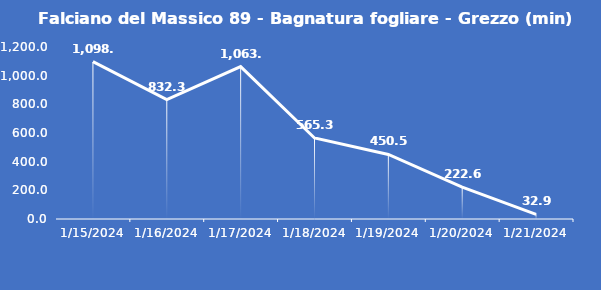
| Category | Falciano del Massico 89 - Bagnatura fogliare - Grezzo (min) |
|---|---|
| 1/15/24 | 1098.1 |
| 1/16/24 | 832.3 |
| 1/17/24 | 1063.6 |
| 1/18/24 | 565.3 |
| 1/19/24 | 450.5 |
| 1/20/24 | 222.6 |
| 1/21/24 | 32.9 |